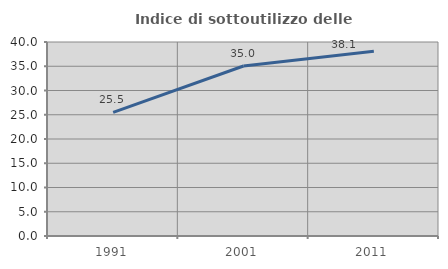
| Category | Indice di sottoutilizzo delle abitazioni  |
|---|---|
| 1991.0 | 25.506 |
| 2001.0 | 35.045 |
| 2011.0 | 38.082 |